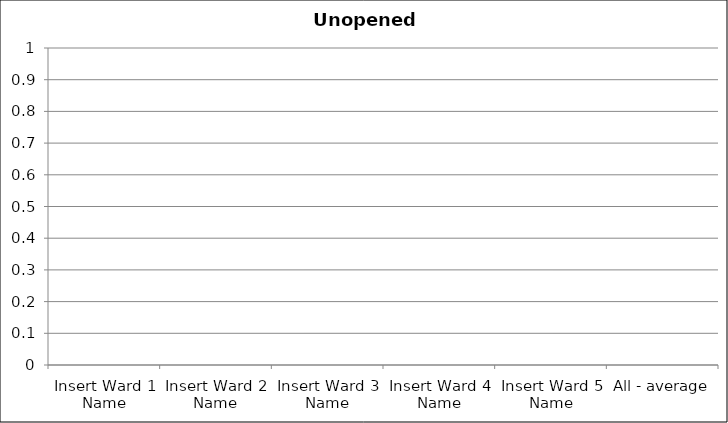
| Category | Unopened condiments |
|---|---|
| Insert Ward 1 Name | 0 |
| Insert Ward 2 Name | 0 |
| Insert Ward 3 Name | 0 |
| Insert Ward 4 Name | 0 |
| Insert Ward 5 Name | 0 |
| All - average | 0 |